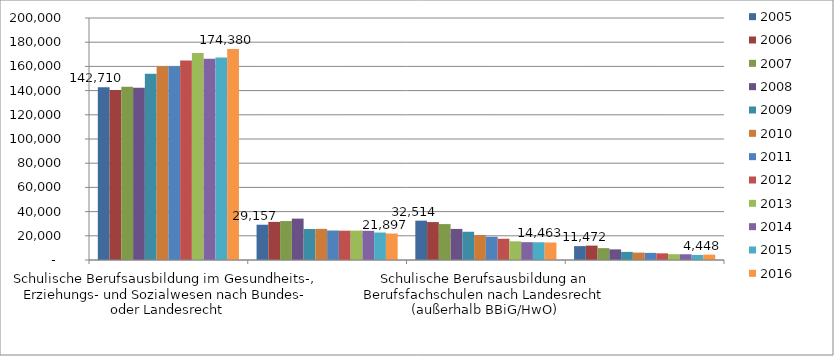
| Category | 2005 | 2006 | 2007 | 2008 | 2009 | 2010 | 2011 | 2012 | 2013 | 2014 | 2015 | 2016 |
|---|---|---|---|---|---|---|---|---|---|---|---|---|
| Schulische Berufsausbildung im Gesundheits-, Erziehungs- und Sozialwesen nach Bundes- oder Landesrecht | 142710 | 140484 | 143144 | 142407 | 153840 | 159850 | 160141 | 164775.74 | 171080.959 | 166407.185 | 167330 | 174380 |
| Schulische Berufsausbildung mit Erwerb einer HZB (doppelqualifizierend)* | 29157 | 31495 | 32189 | 34209 | 25623 | 25718 | 24379 | 24234.043 | 24292 | 24145 | 22697 | 21897 |
| Schulische Berufsausbildung an Berufsfachschulen nach Landesrecht (außerhalb BBiG/HwO) | 32514 | 31341 | 29683 | 25693 | 23352 | 20677 | 19223 | 17563.92 | 15437 | 14745.763 | 14638.569 | 14463 |
| Schulische Berufsausbildung an Berufsfachschulen nach BBiG/HwO | 11472 | 11903 | 9813 | 8780 | 6709 | 6118 | 5874 | 5505.534 | 4792 | 4734.512 | 4158 | 4448 |